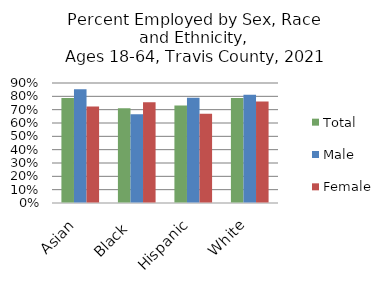
| Category | Total  | Male  | Female |
|---|---|---|---|
| Asian | 0.788 | 0.853 | 0.725 |
| Black  | 0.711 | 0.666 | 0.757 |
| Hispanic | 0.732 | 0.79 | 0.67 |
| White | 0.787 | 0.811 | 0.761 |